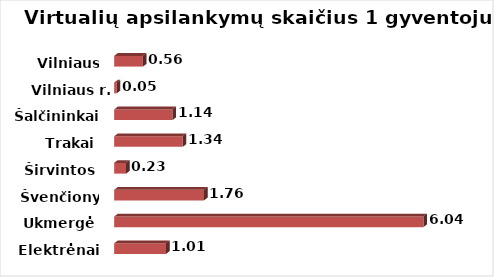
| Category | Series 0 |
|---|---|
| Elektrėnai | 1.013 |
| Ukmergė | 6.039 |
| Švenčionys | 1.755 |
| Širvintos | 0.233 |
| Trakai | 1.338 |
| Šalčininkai | 1.138 |
| Vilniaus r. | 0.049 |
| Vilniaus m. | 0.562 |